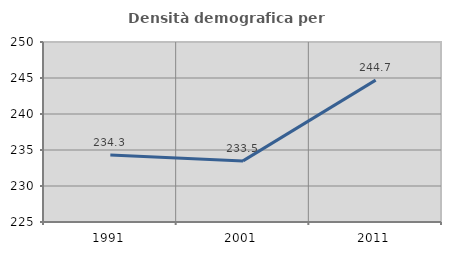
| Category | Densità demografica |
|---|---|
| 1991.0 | 234.291 |
| 2001.0 | 233.486 |
| 2011.0 | 244.705 |